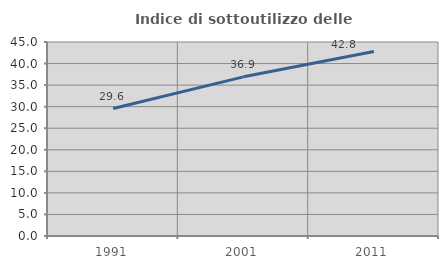
| Category | Indice di sottoutilizzo delle abitazioni  |
|---|---|
| 1991.0 | 29.556 |
| 2001.0 | 36.918 |
| 2011.0 | 42.808 |